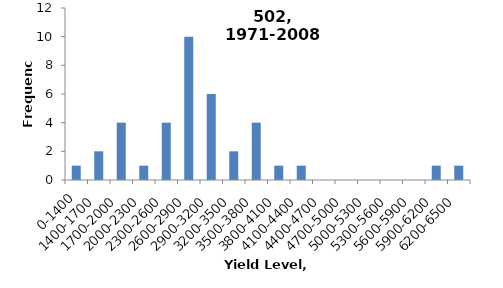
| Category | Frequency |
|---|---|
| 0-1400 | 1 |
| 1400-1700 | 2 |
| 1700-2000 | 4 |
| 2000-2300 | 1 |
| 2300-2600 | 4 |
| 2600-2900 | 10 |
| 2900-3200 | 6 |
| 3200-3500 | 2 |
| 3500-3800 | 4 |
| 3800-4100 | 1 |
| 4100-4400 | 1 |
| 4400-4700 | 0 |
| 4700-5000 | 0 |
| 5000-5300 | 0 |
| 5300-5600 | 0 |
| 5600-5900 | 0 |
| 5900-6200 | 1 |
| 6200-6500 | 1 |